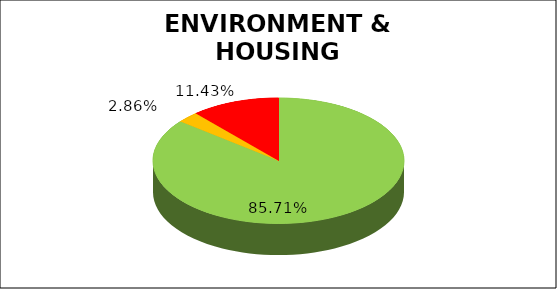
| Category | Q4 |
|---|---|
| Green | 0.857 |
| Amber | 0.029 |
| Red | 0.114 |